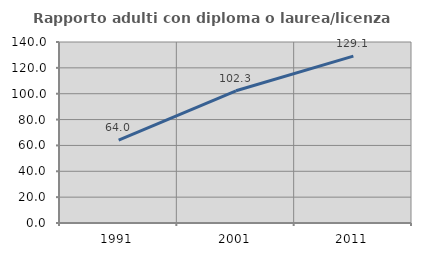
| Category | Rapporto adulti con diploma o laurea/licenza media  |
|---|---|
| 1991.0 | 64.019 |
| 2001.0 | 102.253 |
| 2011.0 | 129.088 |